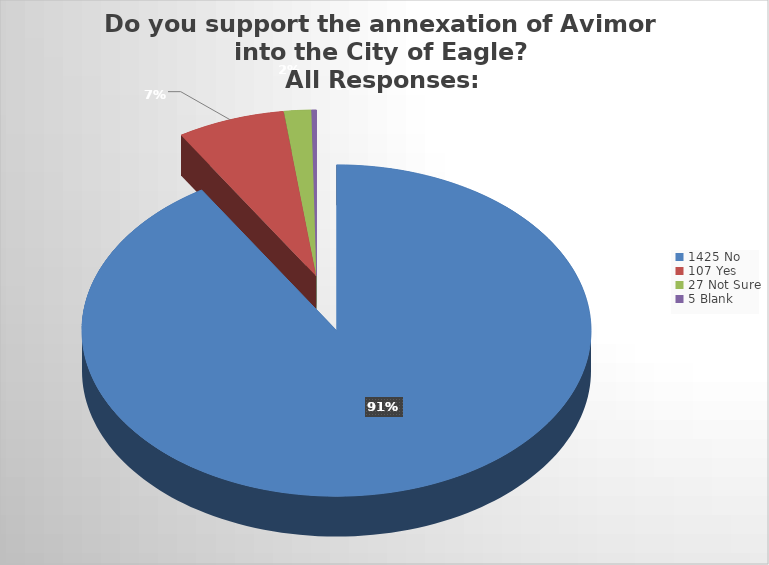
| Category | Series 0 |
|---|---|
| 0 | 0.911 |
| 1 | 0.068 |
| 2 | 0.017 |
| 3 | 0.003 |